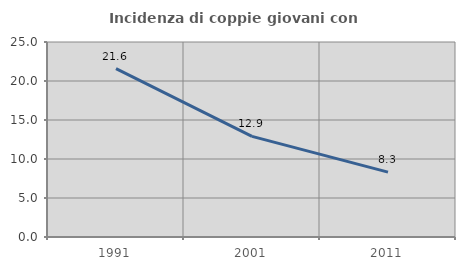
| Category | Incidenza di coppie giovani con figli |
|---|---|
| 1991.0 | 21.598 |
| 2001.0 | 12.897 |
| 2011.0 | 8.319 |